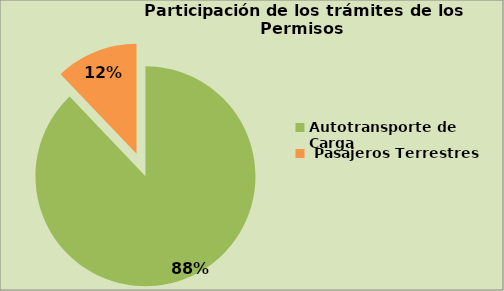
| Category | Series 0 |
|---|---|
| Autotransporte de Carga  | 87.882 |
|  Pasajeros Terrestres | 12.118 |